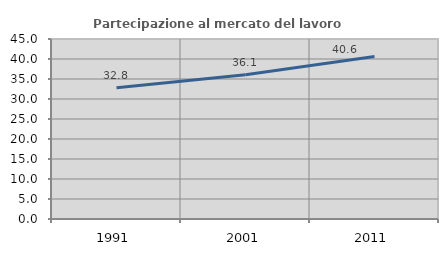
| Category | Partecipazione al mercato del lavoro  femminile |
|---|---|
| 1991.0 | 32.811 |
| 2001.0 | 36.07 |
| 2011.0 | 40.646 |